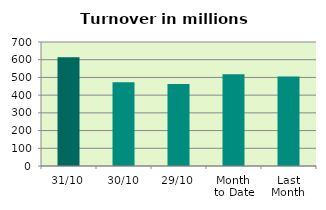
| Category | Series 0 |
|---|---|
| 31/10 | 614.003 |
| 30/10 | 472.541 |
| 29/10 | 463.524 |
| Month 
to Date | 517.71 |
| Last
Month | 505.274 |